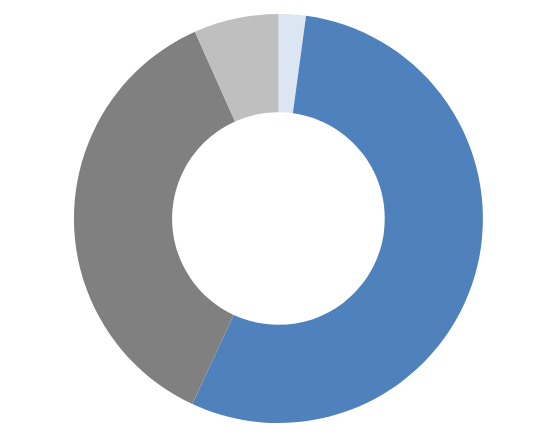
| Category | Series 0 |
|---|---|
| Basic Charge | 343.66 |
| Energy Charge | 8745.076 |
| Demand Charge | 5808 |
| Reactive Charge | 1070 |